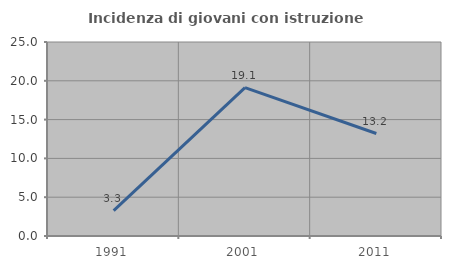
| Category | Incidenza di giovani con istruzione universitaria |
|---|---|
| 1991.0 | 3.279 |
| 2001.0 | 19.118 |
| 2011.0 | 13.208 |